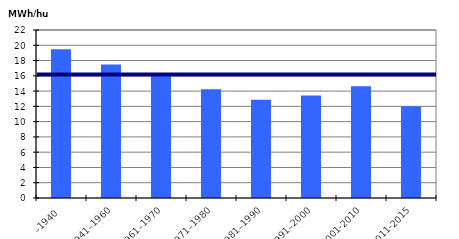
| Category | MWH/hus |
|---|---|
| –1940 | 19.495 |
| 1941–1960 | 17.486 |
| 1961–1970 | 16.085 |
| 1971–1980 | 14.257 |
| 1981–1990 | 12.865 |
| 1991–2000 | 13.43 |
| 2001-2010 | 14.649 |
| 2011-2015 | 12.009 |